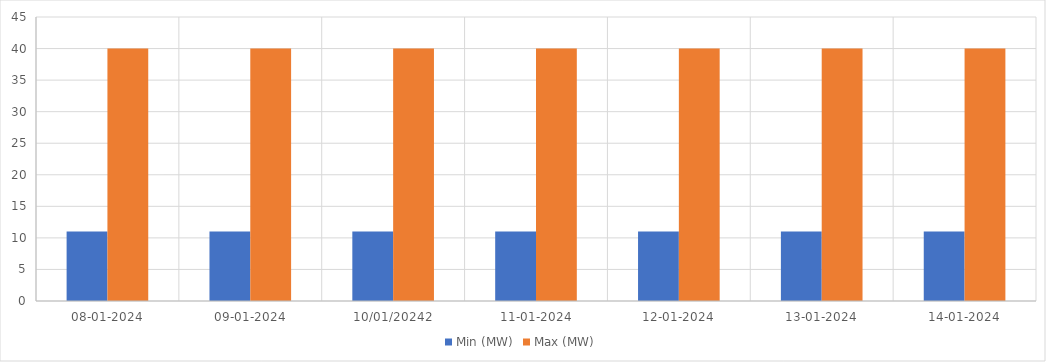
| Category | Min (MW) | Max (MW) |
|---|---|---|
| 08-01-2024 | 11 | 40 |
| 09-01-2024 | 11 | 40 |
| 10/01/20242 | 11 | 40 |
| 11-01-2024 | 11 | 40 |
| 12-01-2024 | 11 | 40 |
| 13-01-2024 | 11 | 40 |
| 14-01-2024 | 11 | 40 |